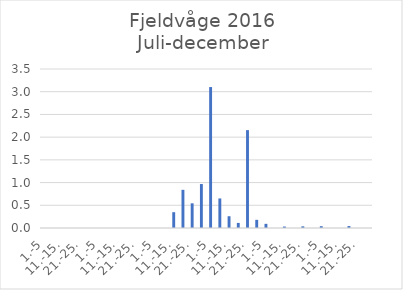
| Category | Series 0 |
|---|---|
| 1.-5 | 0 |
| 6.-10. | 0 |
| 11.-15. | 0 |
| 16.-20. | 0 |
| 21.-25. | 0 |
| 26.-31. | 0 |
| 1.-5 | 0 |
| 6.-10. | 0 |
| 11.-15. | 0 |
| 16.-20. | 0 |
| 21.-25. | 0 |
| 26.-31. | 0 |
| 1.-5 | 0 |
| 6.-10. | 0 |
| 11.-15. | 0.348 |
| 16.-20. | 0.84 |
| 21.-25. | 0.544 |
| 26.-30. | 0.968 |
| 1.-5 | 3.102 |
| 6.-10. | 0.651 |
| 11.-15. | 0.259 |
| 16.-20. | 0.112 |
| 21.-25. | 2.154 |
| 26.-31. | 0.18 |
| 1.-5 | 0.091 |
| 6.-10. | 0 |
| 11.-15. | 0.032 |
| 16.-20. | 0 |
| 21.-25. | 0.037 |
| 26.-30. | 0 |
| 1.-5 | 0.04 |
| 6.-10. | 0 |
| 11.-15. | 0 |
| 16.-20. | 0.043 |
| 21.-25. | 0 |
| 26.-31. | 0 |